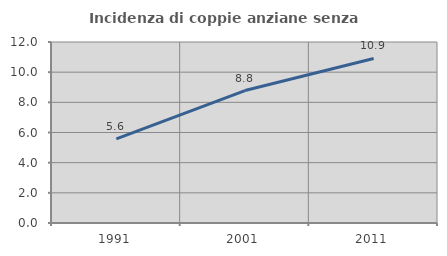
| Category | Incidenza di coppie anziane senza figli  |
|---|---|
| 1991.0 | 5.577 |
| 2001.0 | 8.782 |
| 2011.0 | 10.91 |